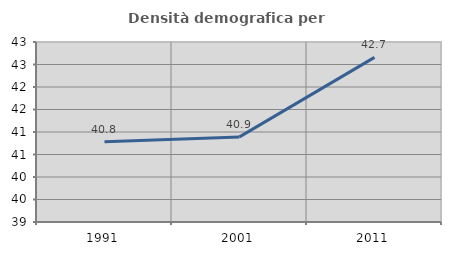
| Category | Densità demografica |
|---|---|
| 1991.0 | 40.783 |
| 2001.0 | 40.891 |
| 2011.0 | 42.658 |